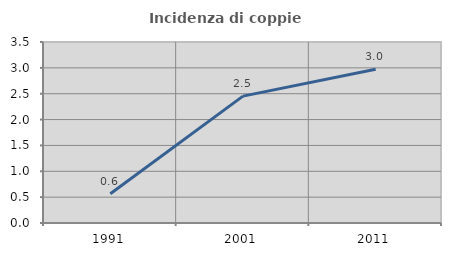
| Category | Incidenza di coppie miste |
|---|---|
| 1991.0 | 0.565 |
| 2001.0 | 2.453 |
| 2011.0 | 2.974 |